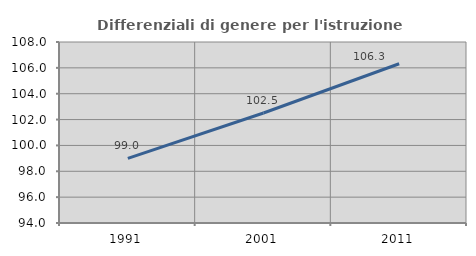
| Category | Differenziali di genere per l'istruzione superiore |
|---|---|
| 1991.0 | 98.998 |
| 2001.0 | 102.51 |
| 2011.0 | 106.32 |